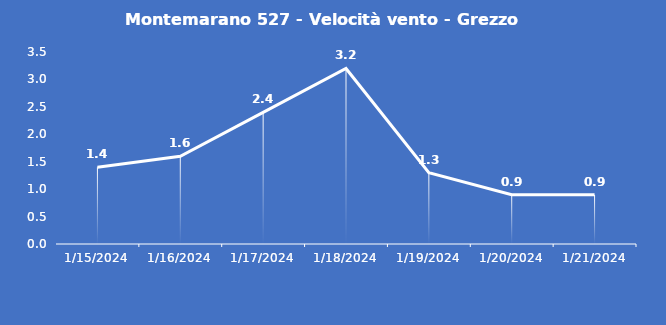
| Category | Montemarano 527 - Velocità vento - Grezzo (m/s) |
|---|---|
| 1/15/24 | 1.4 |
| 1/16/24 | 1.6 |
| 1/17/24 | 2.4 |
| 1/18/24 | 3.2 |
| 1/19/24 | 1.3 |
| 1/20/24 | 0.9 |
| 1/21/24 | 0.9 |